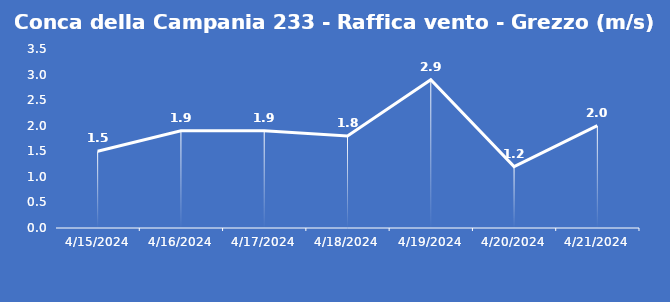
| Category | Conca della Campania 233 - Raffica vento - Grezzo (m/s) |
|---|---|
| 4/15/24 | 1.5 |
| 4/16/24 | 1.9 |
| 4/17/24 | 1.9 |
| 4/18/24 | 1.8 |
| 4/19/24 | 2.9 |
| 4/20/24 | 1.2 |
| 4/21/24 | 2 |